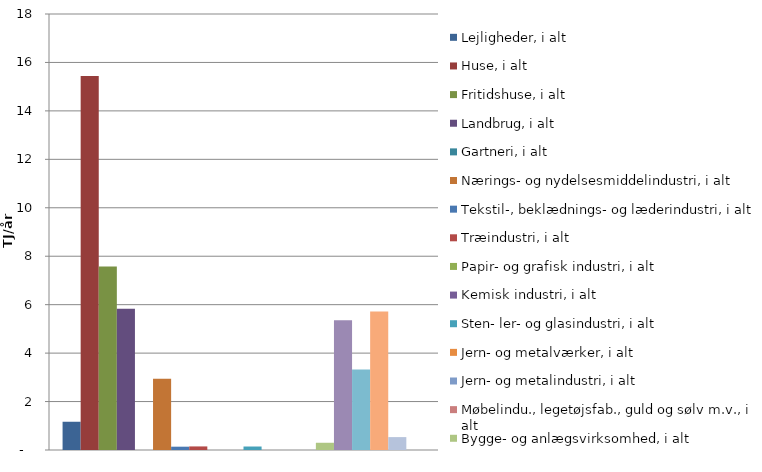
| Category | Lejligheder, i alt | Huse, i alt | Fritidshuse, i alt | Landbrug, i alt | Gartneri, i alt | Nærings- og nydelsesmiddelindustri, i alt | Tekstil-, beklædnings- og læderindustri, i alt | Træindustri, i alt | Papir- og grafisk industri, i alt | Kemisk industri, i alt | Sten- ler- og glasindustri, i alt | Jern- og metalværker, i alt | Jern- og metalindustri, i alt | Møbelindu., legetøjsfab., guld og sølv m.v., i alt | Bygge- og anlægsvirksomhed, i alt | Detail- og engroshandel, i alt | Service- og forlystelsesvirksomhed, i alt | Offentlige foretageneder, i alt | Gade- og vejbelysning, i alt | Elektriske baner, i alt |
|---|---|---|---|---|---|---|---|---|---|---|---|---|---|---|---|---|---|---|---|---|
| 0 | 1.166 | 15.444 | 7.578 | 5.836 | 0 | 2.938 | 0.137 | 0.148 | 0 | 0 | 0.144 | 0 | 0 | 0 | 0.299 | 5.353 | 3.326 | 5.717 | 0.533 | 0 |